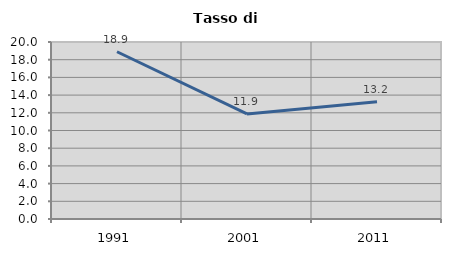
| Category | Tasso di disoccupazione   |
|---|---|
| 1991.0 | 18.896 |
| 2001.0 | 11.868 |
| 2011.0 | 13.249 |